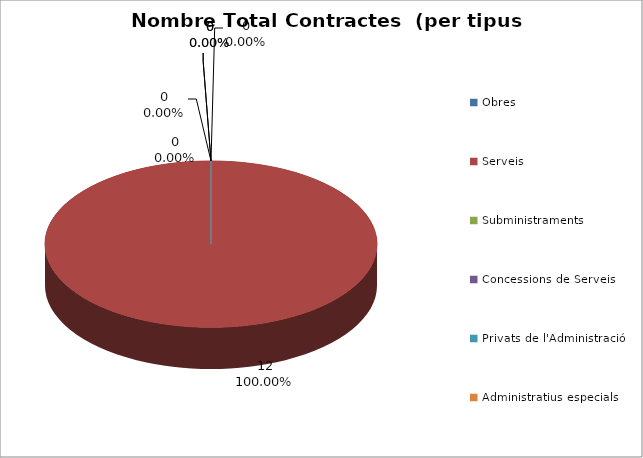
| Category | Nombre Total Contractes |
|---|---|
| Obres | 0 |
| Serveis | 12 |
| Subministraments | 0 |
| Concessions de Serveis | 0 |
| Privats de l'Administració | 0 |
| Administratius especials | 0 |